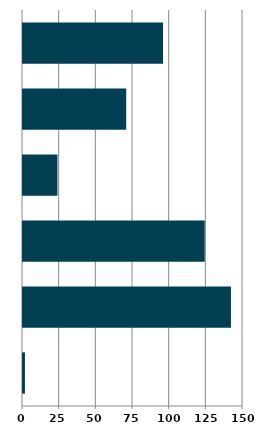
| Category | Series 0 |
|---|---|
| 0 | 1.326 |
| 1 | 141.777 |
| 2 | 123.905 |
| 3 | 23.499 |
| 4 | 70.383 |
| 5 | 95.477 |